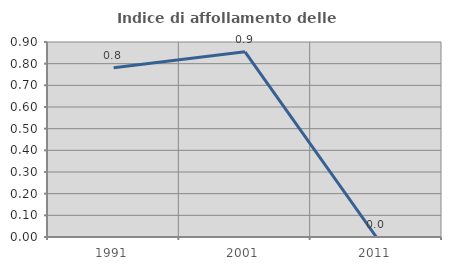
| Category | Indice di affollamento delle abitazioni  |
|---|---|
| 1991.0 | 0.781 |
| 2001.0 | 0.855 |
| 2011.0 | 0 |